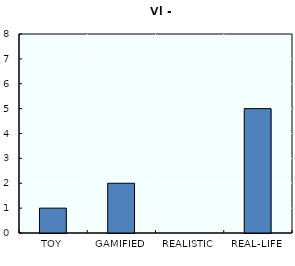
| Category | Series 0 |
|---|---|
| TOY | 1 |
| GAMIFIED | 2 |
| REALISTIC | 0 |
| REAL-LIFE | 5 |